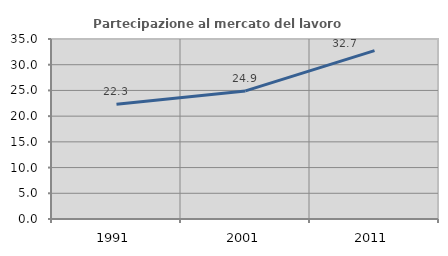
| Category | Partecipazione al mercato del lavoro  femminile |
|---|---|
| 1991.0 | 22.305 |
| 2001.0 | 24.9 |
| 2011.0 | 32.735 |